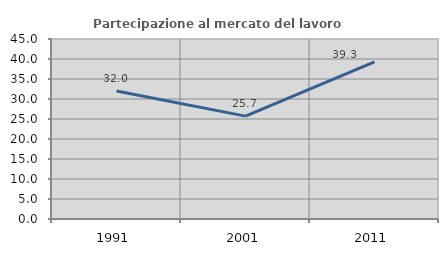
| Category | Partecipazione al mercato del lavoro  femminile |
|---|---|
| 1991.0 | 32.008 |
| 2001.0 | 25.714 |
| 2011.0 | 39.272 |